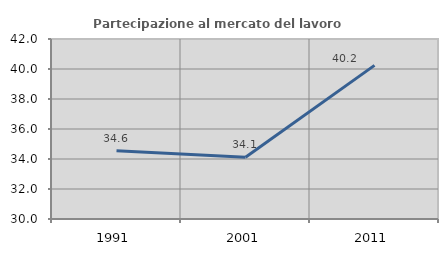
| Category | Partecipazione al mercato del lavoro  femminile |
|---|---|
| 1991.0 | 34.551 |
| 2001.0 | 34.119 |
| 2011.0 | 40.242 |